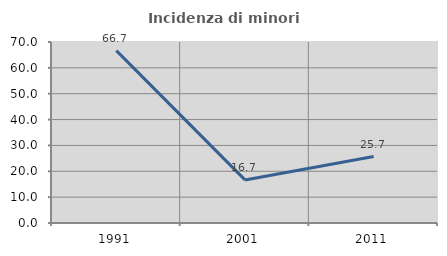
| Category | Incidenza di minori stranieri |
|---|---|
| 1991.0 | 66.667 |
| 2001.0 | 16.667 |
| 2011.0 | 25.714 |